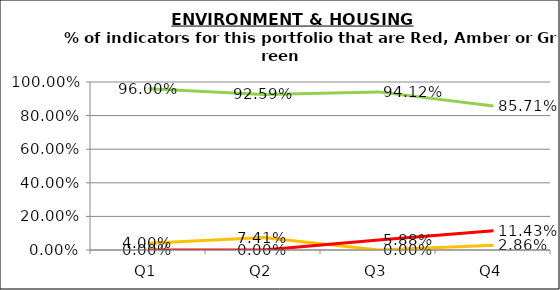
| Category | Green | Amber | Red |
|---|---|---|---|
| Q1 | 0.96 | 0.04 | 0 |
| Q2 | 0.926 | 0.074 | 0 |
| Q3 | 0.941 | 0 | 0.059 |
| Q4 | 0.857 | 0.029 | 0.114 |